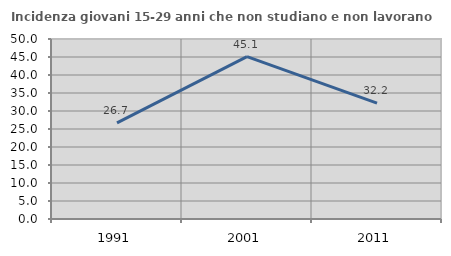
| Category | Incidenza giovani 15-29 anni che non studiano e non lavorano  |
|---|---|
| 1991.0 | 26.684 |
| 2001.0 | 45.088 |
| 2011.0 | 32.208 |